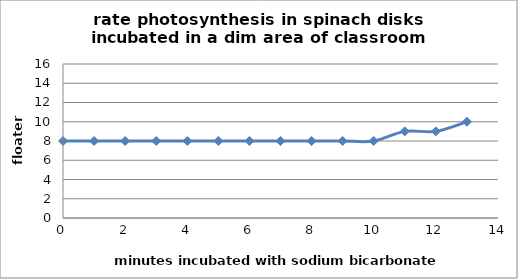
| Category | Series 0 |
|---|---|
| 0.0 | 8 |
| 1.0 | 8 |
| 2.0 | 8 |
| 3.0 | 8 |
| 4.0 | 8 |
| 5.0 | 8 |
| 6.0 | 8 |
| 7.0 | 8 |
| 8.0 | 8 |
| 9.0 | 8 |
| 10.0 | 8 |
| 11.0 | 9 |
| 12.0 | 9 |
| 13.0 | 10 |